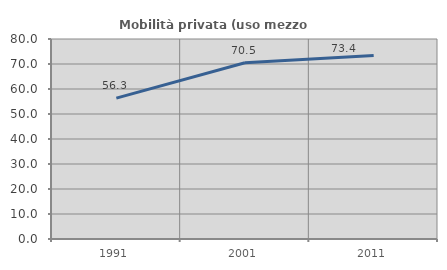
| Category | Mobilità privata (uso mezzo privato) |
|---|---|
| 1991.0 | 56.338 |
| 2001.0 | 70.514 |
| 2011.0 | 73.399 |